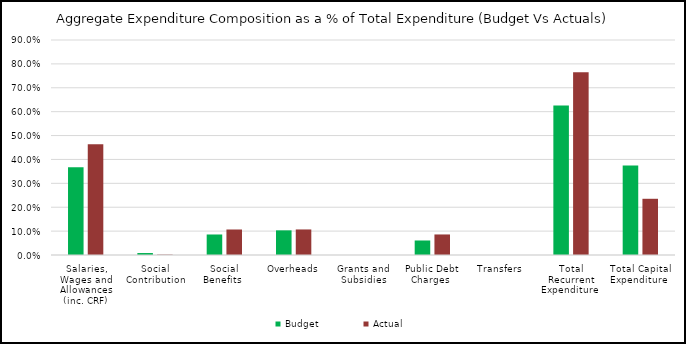
| Category | Budget | Actual |
|---|---|---|
| Salaries, Wages and Allowances (inc. CRF) | 0.368 | 0.463 |
| Social Contribution | 0.008 | 0.002 |
| Social Benefits  | 0.086 | 0.107 |
| Overheads | 0.103 | 0.107 |
| Grants and Subsidies | 0 | 0 |
| Public Debt Charges  | 0.061 | 0.086 |
| Transfers  | 0 | 0 |
| Total Recurrent Expenditure  | 0.626 | 0.765 |
| Total Capital Expenditure  | 0.374 | 0.235 |